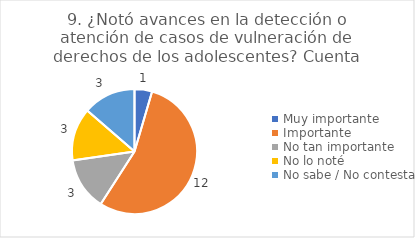
| Category | 9. ¿Notó avances en la detección o atención de casos de vulneración de derechos de los adolescentes? |
|---|---|
| Muy importante  | 0.045 |
| Importante  | 0.545 |
| No tan importante  | 0.136 |
| No lo noté  | 0.136 |
| No sabe / No contesta | 0.136 |